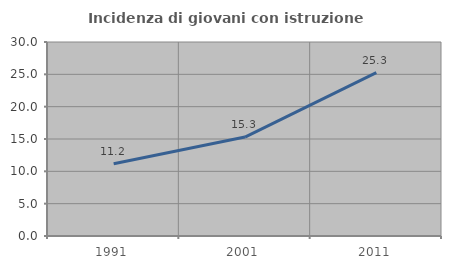
| Category | Incidenza di giovani con istruzione universitaria |
|---|---|
| 1991.0 | 11.185 |
| 2001.0 | 15.295 |
| 2011.0 | 25.268 |